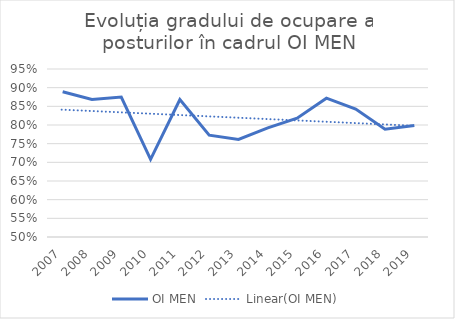
| Category | OI MEN |
|---|---|
| 2007.0 | 0.889 |
| 2008.0 | 0.868 |
| 2009.0 | 0.875 |
| 2010.0 | 0.708 |
| 2011.0 | 0.868 |
| 2012.0 | 0.773 |
| 2013.0 | 0.761 |
| 2014.0 | 0.792 |
| 2015.0 | 0.818 |
| 2016.0 | 0.872 |
| 2017.0 | 0.843 |
| 2018.0 | 0.789 |
| 2019.0 | 0.799 |